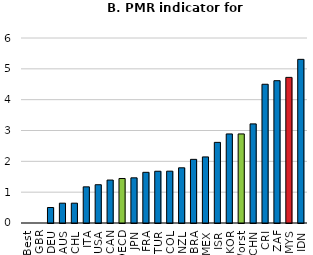
| Category | Series 0 |
|---|---|
| Best | 0 |
| GBR | 0 |
| DEU | 0.502 |
| AUS | 0.643 |
| CHL | 0.643 |
| ITA | 1.173 |
| USA | 1.241 |
| CAN | 1.393 |
| OECD | 1.444 |
| JPN | 1.465 |
| FRA | 1.644 |
| TUR | 1.679 |
| COL | 1.681 |
| NZL | 1.79 |
| BRA | 2.064 |
| MEX | 2.143 |
| ISR | 2.615 |
| KOR | 2.888 |
| Worst | 2.888 |
| CHN | 3.214 |
| CRI | 4.5 |
| ZAF | 4.615 |
| MYS | 4.723 |
| IDN | 5.308 |